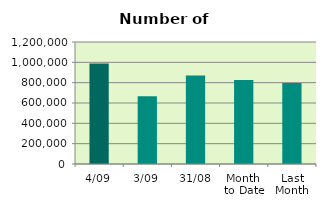
| Category | Series 0 |
|---|---|
| 4/09 | 988678 |
| 3/09 | 665492 |
| 31/08 | 871588 |
| Month 
to Date | 827085 |
| Last
Month | 797310 |